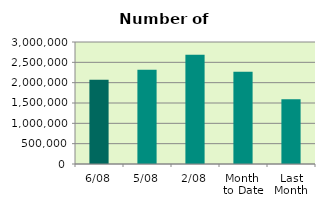
| Category | Series 0 |
|---|---|
| 6/08 | 2070956 |
| 5/08 | 2319276 |
| 2/08 | 2686924 |
| Month 
to Date | 2269398.5 |
| Last
Month | 1591495.826 |